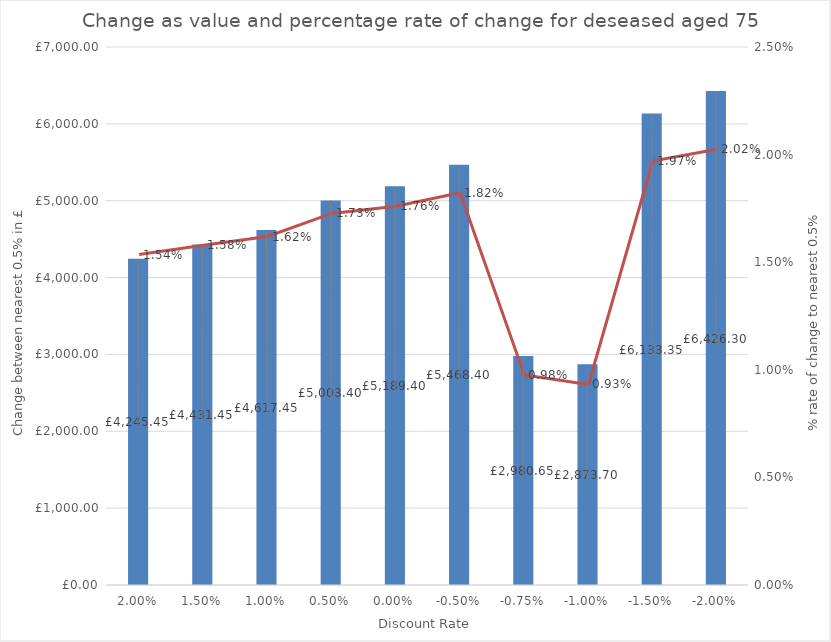
| Category | Value change |
|---|---|
| 0.02 | 4245.45 |
| 0.015 | 4431.45 |
| 0.01 | 4617.45 |
| 0.005 | 5003.4 |
| 0.0 | 5189.4 |
| -0.005 | 5468.4 |
| -0.0075 | 2980.65 |
| -0.01 | 2873.7 |
| -0.015 | 6133.35 |
| -0.02 | 6426.3 |